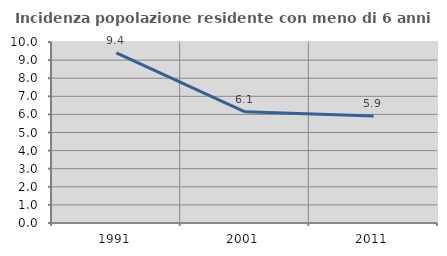
| Category | Incidenza popolazione residente con meno di 6 anni |
|---|---|
| 1991.0 | 9.393 |
| 2001.0 | 6.142 |
| 2011.0 | 5.914 |